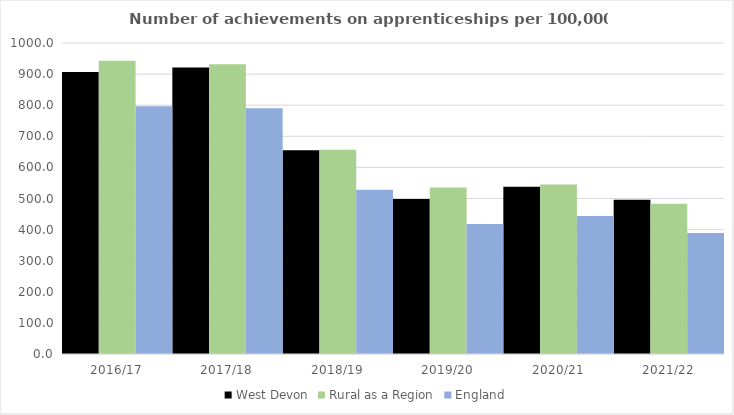
| Category | West Devon | Rural as a Region | England |
|---|---|---|---|
| 2016/17 | 907 | 942.594 | 797 |
| 2017/18 | 921 | 931.709 | 790 |
| 2018/19 | 655 | 656.44 | 528 |
| 2019/20 | 498 | 535.552 | 418 |
| 2020/21 | 538 | 545.333 | 444 |
| 2021/22 | 496 | 482.936 | 389 |